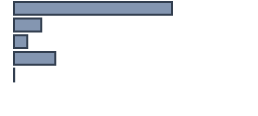
| Category | Percentatge |
|---|---|
| 0 | 65.833 |
| 1 | 11.364 |
| 2 | 5.53 |
| 3 | 17.197 |
| 4 | 0.076 |
| 5 | 0 |